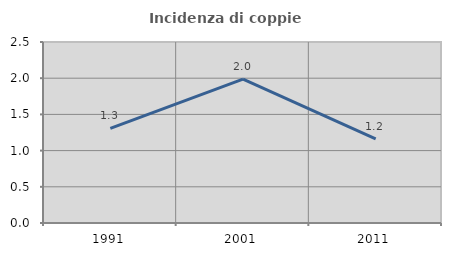
| Category | Incidenza di coppie miste |
|---|---|
| 1991.0 | 1.307 |
| 2001.0 | 1.987 |
| 2011.0 | 1.163 |